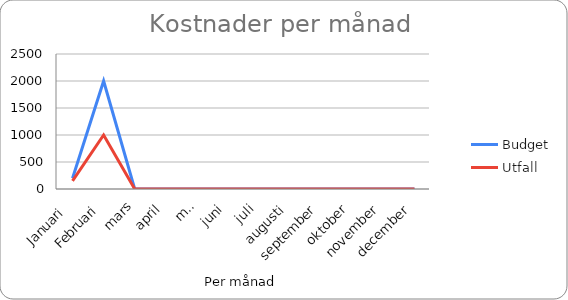
| Category | Budget | Utfall |
|---|---|---|
| Januari  | 200 | 150 |
| Februari | 2000 | 1000 |
| mars | 0 | 0 |
| april | 0 | 0 |
| maj | 0 | 0 |
| juni | 0 | 0 |
| juli | 0 | 0 |
| augusti | 0 | 0 |
| september | 0 | 0 |
| oktober | 0 | 0 |
| november | 0 | 0 |
| december | 0 | 0 |